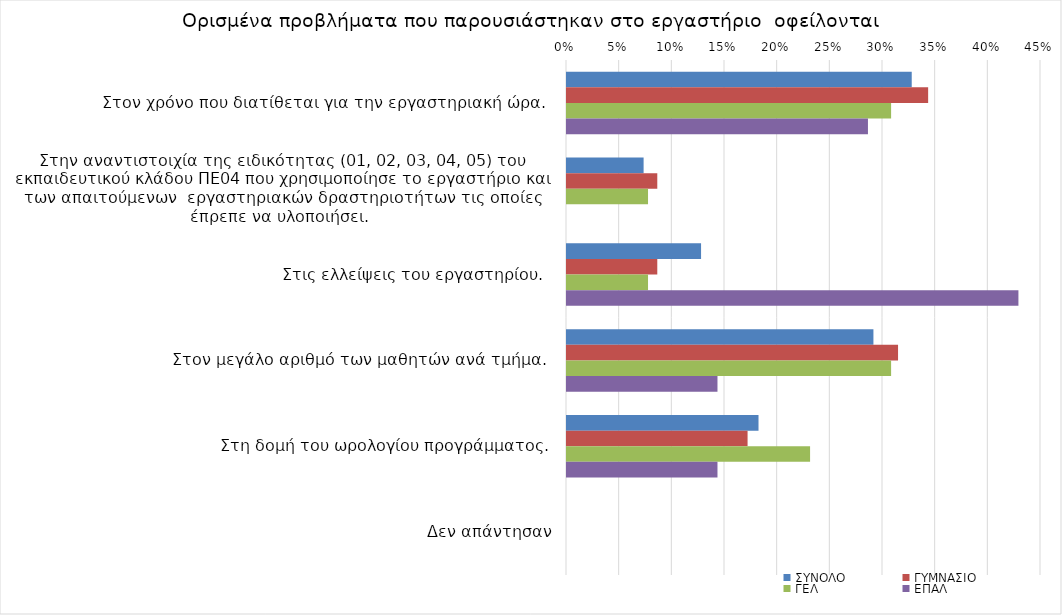
| Category | ΣΥΝΟΛΟ | ΓΥΜΝΑΣΙΟ | ΓΕΛ | ΕΠΑΛ |
|---|---|---|---|---|
| Στον χρόνο που διατίθεται για την εργαστηριακή ώρα.  | 0.327 | 0.343 | 0.308 | 0.286 |
| Στην αναντιστοιχία της ειδικότητας (01, 02, 03, 04, 05) του εκπαιδευτικού κλάδου ΠΕ04 που χρησιμοποίησε το εργαστήριο και των απαιτούμενων  εργαστηριακών δραστηριοτήτων τις οποίες έπρεπε να υλοποιήσει.   | 0.073 | 0.086 | 0.077 | 0 |
| Στις ελλείψεις του εργαστηρίου.  | 0.127 | 0.086 | 0.077 | 0.429 |
| Στον μεγάλο αριθμό των μαθητών ανά τμήμα.  | 0.291 | 0.314 | 0.308 | 0.143 |
| Στη δομή του ωρολογίου προγράμματος. | 0.182 | 0.171 | 0.231 | 0.143 |
| Δεν απάντησαν | 0 | 0 | 0 | 0 |